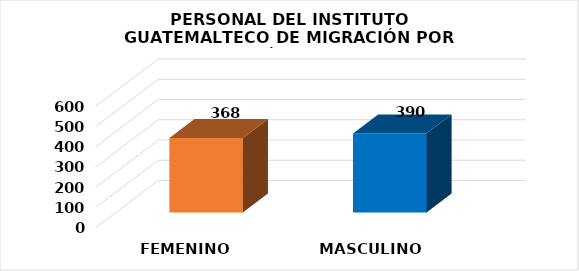
| Category | Series 0 |
|---|---|
| FEMENINO | 368 |
| MASCULINO | 390 |